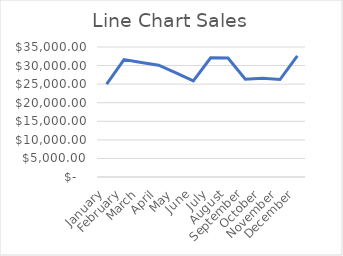
| Category | Sales |
|---|---|
| January | 25016 |
| February | 31600 |
| March | 30812 |
| April | 30090 |
| May | 28061 |
| June | 25853 |
| July | 32098 |
| August | 32050 |
| September | 26327 |
| October | 26566 |
| November | 26237 |
| December | 32585 |